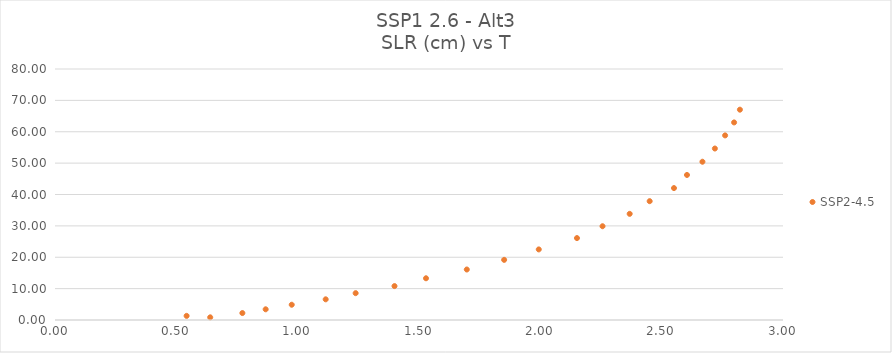
| Category | SSP2-4.5 |
|---|---|
| 0.639593181 | 0.851 |
| 0.542364652 | 1.315 |
| 0.772130534 | 2.215 |
| 0.868150926 | 3.412 |
| 0.975561417 | 4.865 |
| 1.115501613 | 6.592 |
| 1.238923475 | 8.555 |
| 1.399070338 | 10.811 |
| 1.52886377 | 13.299 |
| 1.696931221 | 16.094 |
| 1.850873574 | 19.169 |
| 1.993542691 | 22.497 |
| 2.150991025 | 26.11 |
| 2.256306515 | 29.886 |
| 2.368166711 | 33.833 |
| 2.450557201 | 37.874 |
| 2.550736809 | 42.046 |
| 2.604302005 | 46.229 |
| 2.668042201 | 50.443 |
| 2.719270926 | 54.654 |
| 2.76149024 | 58.835 |
| 2.798506907 | 62.973 |
| 2.822442005 | 67.034 |